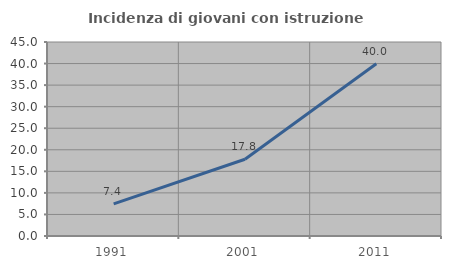
| Category | Incidenza di giovani con istruzione universitaria |
|---|---|
| 1991.0 | 7.448 |
| 2001.0 | 17.812 |
| 2011.0 | 39.958 |